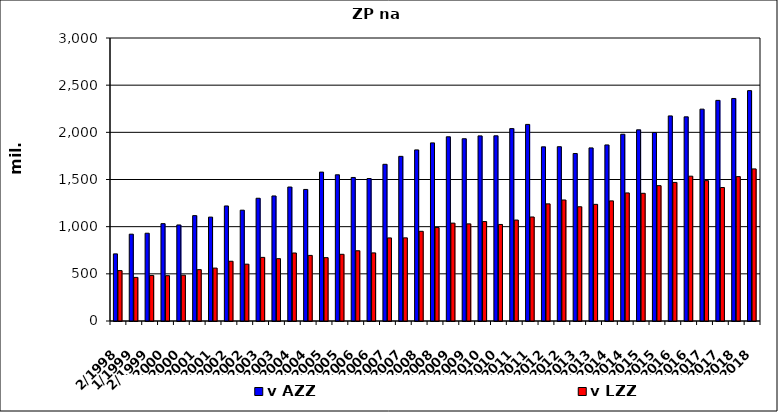
| Category | v AZZ | v LZZ |
|---|---|---|
| 2/1998 | 711414.171 | 534242.558 |
| 1/1999 | 920302.954 | 462286.014 |
| 2/1999 | 930445.107 | 483033.926 |
| 1/2000 | 1031952.085 | 480399.569 |
| 2/2000 | 1018095.112 | 485718.634 |
| 1/2001 | 1116926.37 | 544388.675 |
| 2/2001 | 1101406.096 | 560917.871 |
| 1/2002 | 1219414 | 633354 |
| 2/2002 | 1174789 | 602455 |
| 1/2003 | 1301189 | 674435 |
| 2/2003 | 1325424.754 | 660800.84 |
| 1/2004 | 1420249.023 | 720856.168 |
| 2/2004 | 1394520.468 | 695499.598 |
| 1/2005 | 1578471 | 671638 |
| 2/2005 | 1549740.342 | 707046.058 |
| 1/2006 | 1521606 | 744539 |
| 2/2006 | 1510198.97 | 721965.03 |
| 1/2007 | 1661002.184 | 880589.816 |
| 2/2007 | 1745378.816 | 881432.184 |
| 1/2008 | 1813809 | 950827 |
| 2/2008 | 1888222 | 990770 |
| 1/2009 | 1952756 | 1037430 |
| 2/2009 | 1932228 | 1029735 |
| 1/2010 | 1962384 | 1054124 |
| 2/2010 | 1963123 | 1023437 |
| 1/2011 | 2039415 | 1070287 |
| 2/2011 | 2083941 | 1102511 |
| 1/2012 | 1846103 | 1241652 |
| 2/2012 | 1847657 | 1282913 |
| 1/2013 | 1775761 | 1211099 |
| 2/2013 | 1835013 | 1236597 |
| 1/2014 | 1866394 | 1273271 |
| 2/2014 | 1979688 | 1357615 |
| 1/2015 | 2026577 | 1353741 |
| 2/2015 | 1998070 | 1434903 |
| 1/2016 | 2174002.676 | 1469226.324 |
| 2/2016 | 2164131.166 | 1535147.834 |
| 1/2017 | 2245760 | 1488019 |
| 2/2017 | 2338917 | 1414976 |
| 1/2018 | 2358903.41 | 1530593.92 |
| 2/2018 | 2441997.21 | 1612439.39 |